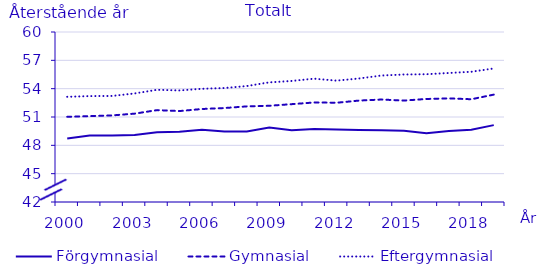
| Category | Förgymnasial | Gymnasial | Eftergymnasial |
|---|---|---|---|
| 2000.0 | 48.731 | 51.02 | 53.137 |
| 2001.0 | 49.05 | 51.09 | 53.215 |
| 2002.0 | 49.047 | 51.169 | 53.227 |
| 2003.0 | 49.095 | 51.354 | 53.494 |
| 2004.0 | 49.374 | 51.728 | 53.879 |
| 2005.0 | 49.45 | 51.628 | 53.812 |
| 2006.0 | 49.641 | 51.846 | 53.988 |
| 2007.0 | 49.465 | 51.948 | 54.069 |
| 2008.0 | 49.458 | 52.125 | 54.278 |
| 2009.0 | 49.886 | 52.189 | 54.669 |
| 2010.0 | 49.592 | 52.36 | 54.819 |
| 2011.0 | 49.723 | 52.538 | 55.057 |
| 2012.0 | 49.68 | 52.51 | 54.85 |
| 2013.0 | 49.63 | 52.74 | 55.08 |
| 2014.0 | 49.61 | 52.85 | 55.39 |
| 2015.0 | 49.54 | 52.74 | 55.5 |
| 2016.0 | 49.27 | 52.91 | 55.53 |
| 2017.0 | 49.53 | 52.97 | 55.66 |
| 2018.0 | 49.66 | 52.88 | 55.79 |
| 2019.0 | 50.14 | 53.37 | 56.14 |